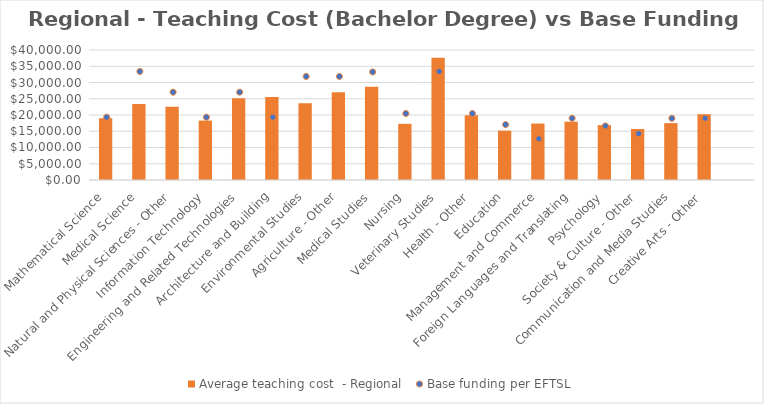
| Category | Average teaching cost  - Regional  |
|---|---|
| Mathematical Science | 19003.143 |
| Medical Science | 23362.201 |
| Natural and Physical Sciences - Other | 22550.63 |
| Information Technology | 18282.13 |
| Engineering and Related Technologies | 25152.846 |
| Architecture and Building | 25573.247 |
| Environmental Studies | 23636.103 |
| Agriculture - Other | 26961.872 |
| Medical Studies | 28664.232 |
| Nursing | 17283.758 |
| Veterinary Studies | 37630.204 |
| Health - Other | 19922.858 |
| Education | 15193.071 |
| Management and Commerce | 17373.301 |
| Foreign Languages and Translating | 17941.404 |
| Psychology | 16872.009 |
| Society & Culture - Other | 15701.033 |
| Communication and Media Studies | 17494.046 |
| Creative Arts - Other | 20265.087 |